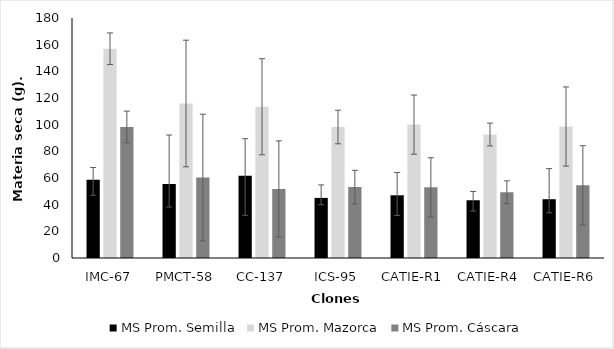
| Category | MS Prom. Semilla | MS Prom. Mazorca | MS Prom. Cáscara |
|---|---|---|---|
| IMC-67 | 58.66 | 156.94 | 98.28 |
| PMCT-58 | 55.54 | 115.893 | 60.353 |
| CC-137 | 61.627 | 113.44 | 51.813 |
| ICS-95 | 45.07 | 98.243 | 53.173 |
| CATIE-R1 | 47.023 | 100.037 | 53.013 |
| CATIE-R4 | 43.313 | 92.627 | 49.31 |
| CATIE-R6 | 44.09 | 98.603 | 54.517 |